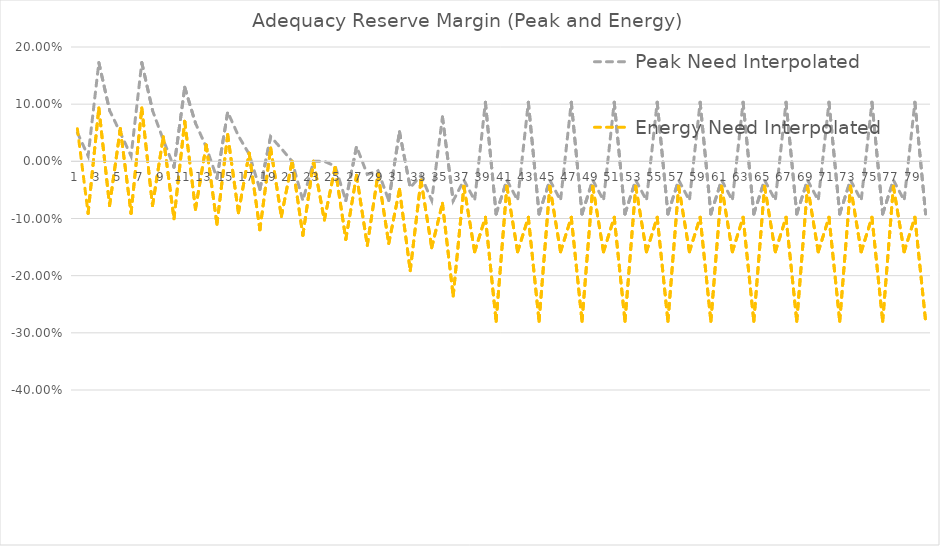
| Category | Peak Need Interpolated | Energy Need Interpolated |
|---|---|---|
| 0 | 0.05 | 0.057 |
| 1 | 0.009 | -0.091 |
| 2 | 0.173 | 0.093 |
| 3 | 0.089 | -0.077 |
| 4 | 0.05 | 0.057 |
| 5 | 0.009 | -0.091 |
| 6 | 0.173 | 0.093 |
| 7 | 0.089 | -0.077 |
| 8 | 0.038 | 0.043 |
| 9 | -0.01 | -0.1 |
| 10 | 0.13 | 0.07 |
| 11 | 0.067 | -0.084 |
| 12 | 0.025 | 0.029 |
| 13 | -0.03 | -0.11 |
| 14 | 0.086 | 0.047 |
| 15 | 0.044 | -0.09 |
| 16 | 0.013 | 0.014 |
| 17 | -0.049 | -0.12 |
| 18 | 0.043 | 0.023 |
| 19 | 0.022 | -0.096 |
| 20 | 0 | 0 |
| 21 | -0.069 | -0.129 |
| 22 | 0 | 0 |
| 23 | 0 | -0.103 |
| 24 | -0.008 | -0.011 |
| 25 | -0.069 | -0.137 |
| 26 | 0.026 | -0.024 |
| 27 | -0.023 | -0.147 |
| 28 | -0.016 | -0.022 |
| 29 | -0.068 | -0.144 |
| 30 | 0.052 | -0.049 |
| 31 | -0.046 | -0.191 |
| 32 | -0.025 | -0.033 |
| 33 | -0.068 | -0.151 |
| 34 | 0.078 | -0.073 |
| 35 | -0.069 | -0.236 |
| 36 | -0.033 | -0.044 |
| 37 | -0.068 | -0.158 |
| 38 | 0.103 | -0.098 |
| 39 | -0.092 | -0.28 |
| 40 | -0.033 | -0.044 |
| 41 | -0.068 | -0.158 |
| 42 | 0.103 | -0.098 |
| 43 | -0.092 | -0.28 |
| 44 | -0.033 | -0.044 |
| 45 | -0.068 | -0.158 |
| 46 | 0.103 | -0.098 |
| 47 | -0.092 | -0.28 |
| 48 | -0.033 | -0.044 |
| 49 | -0.068 | -0.158 |
| 50 | 0.103 | -0.098 |
| 51 | -0.092 | -0.28 |
| 52 | -0.033 | -0.044 |
| 53 | -0.068 | -0.158 |
| 54 | 0.103 | -0.098 |
| 55 | -0.092 | -0.28 |
| 56 | -0.033 | -0.044 |
| 57 | -0.068 | -0.158 |
| 58 | 0.103 | -0.098 |
| 59 | -0.092 | -0.28 |
| 60 | -0.033 | -0.044 |
| 61 | -0.068 | -0.158 |
| 62 | 0.103 | -0.098 |
| 63 | -0.092 | -0.28 |
| 64 | -0.033 | -0.044 |
| 65 | -0.068 | -0.158 |
| 66 | 0.103 | -0.098 |
| 67 | -0.092 | -0.28 |
| 68 | -0.033 | -0.044 |
| 69 | -0.068 | -0.158 |
| 70 | 0.103 | -0.098 |
| 71 | -0.092 | -0.28 |
| 72 | -0.033 | -0.044 |
| 73 | -0.068 | -0.158 |
| 74 | 0.103 | -0.098 |
| 75 | -0.092 | -0.28 |
| 76 | -0.033 | -0.044 |
| 77 | -0.068 | -0.158 |
| 78 | 0.103 | -0.098 |
| 79 | -0.092 | -0.28 |